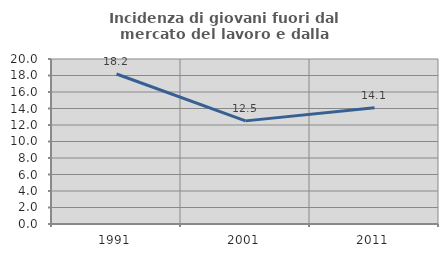
| Category | Incidenza di giovani fuori dal mercato del lavoro e dalla formazione  |
|---|---|
| 1991.0 | 18.182 |
| 2001.0 | 12.5 |
| 2011.0 | 14.085 |